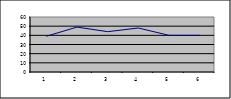
| Category | Series 0 |
|---|---|
| 0 | 39 |
| 1 | 49 |
| 2 | 44 |
| 3 | 48 |
| 4 | 40 |
| 5 | 40 |